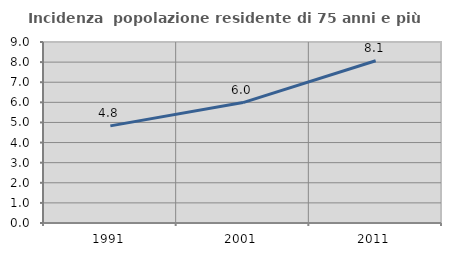
| Category | Incidenza  popolazione residente di 75 anni e più |
|---|---|
| 1991.0 | 4.829 |
| 2001.0 | 5.989 |
| 2011.0 | 8.07 |